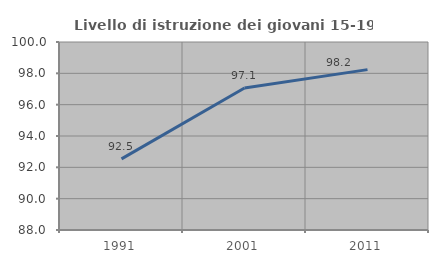
| Category | Livello di istruzione dei giovani 15-19 anni |
|---|---|
| 1991.0 | 92.539 |
| 2001.0 | 97.065 |
| 2011.0 | 98.236 |